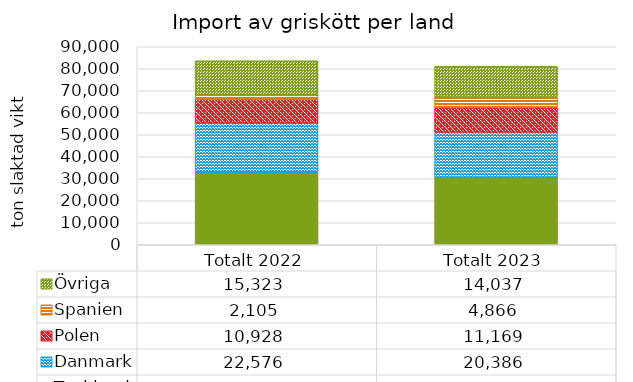
| Category | Tyskland | Danmark | Polen | Spanien | Övriga |
|---|---|---|---|---|---|
| Totalt 2022 | 32713.359 | 22575.724 | 10928.135 | 2105.192 | 15322.976 |
| Totalt 2023 | 30721.299 | 20386.069 | 11168.959 | 4866.227 | 14037.383 |